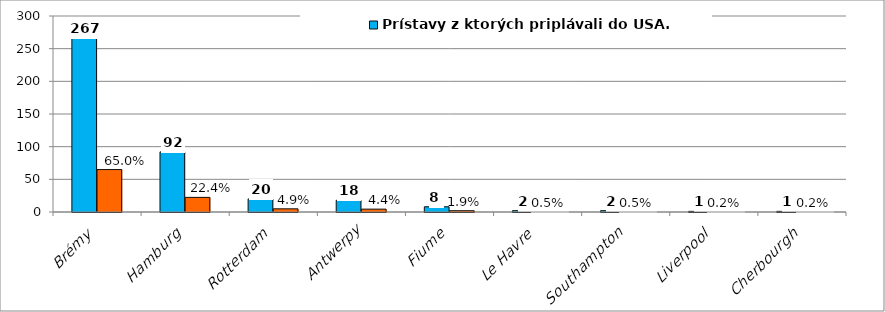
| Category | Prístavy z ktorých priplávali do USA. | Series 1 |
|---|---|---|
| Brémy | 267 | 64.964 |
| Hamburg | 92 | 22.384 |
| Rotterdam | 20 | 4.866 |
| Antwerpy | 18 | 4.38 |
| Fiume | 8 | 1.946 |
| Le Havre | 2 | 0.487 |
| Southampton | 2 | 0.487 |
| Liverpool | 1 | 0.243 |
| Cherbourgh | 1 | 0.243 |